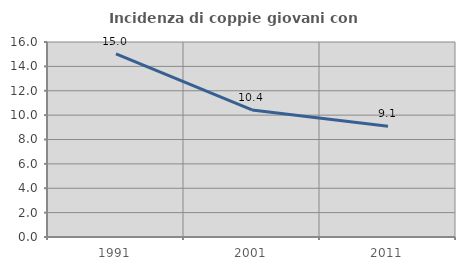
| Category | Incidenza di coppie giovani con figli |
|---|---|
| 1991.0 | 15.022 |
| 2001.0 | 10.422 |
| 2011.0 | 9.091 |